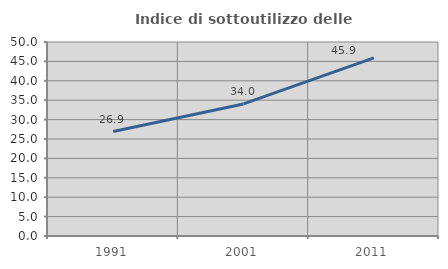
| Category | Indice di sottoutilizzo delle abitazioni  |
|---|---|
| 1991.0 | 26.911 |
| 2001.0 | 34.036 |
| 2011.0 | 45.906 |